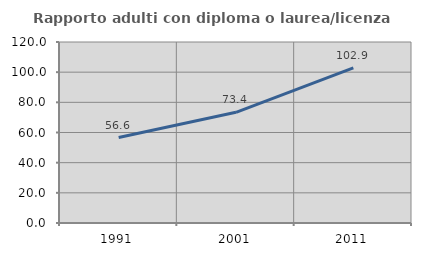
| Category | Rapporto adulti con diploma o laurea/licenza media  |
|---|---|
| 1991.0 | 56.627 |
| 2001.0 | 73.393 |
| 2011.0 | 102.89 |